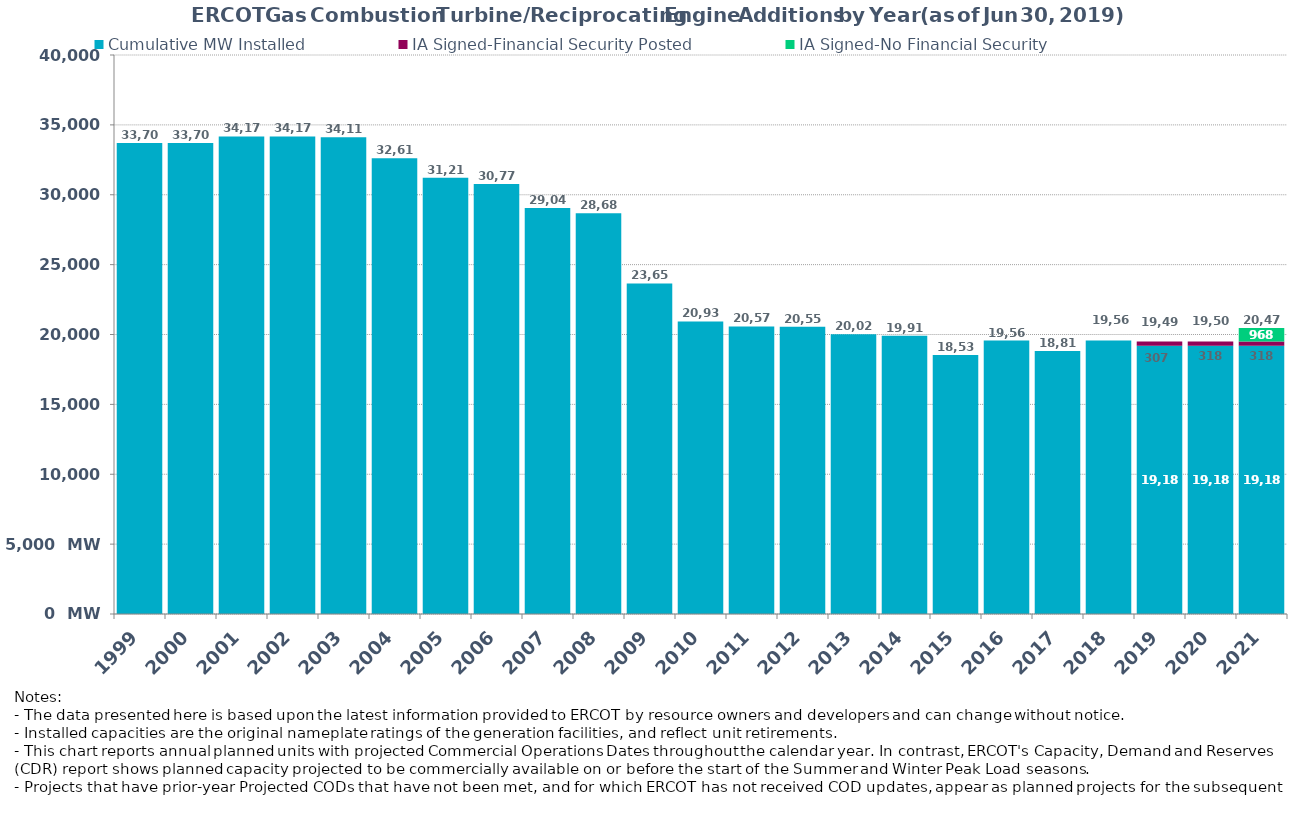
| Category | Cumulative MW Installed | IA Signed-Financial Security Posted  | IA Signed-No Financial Security  | Cumulative Installed and Planned |
|---|---|---|---|---|
| 1999.0 | 33703 | 0 | 0 | 33703 |
| 2000.0 | 33703 | 0 | 0 | 33703 |
| 2001.0 | 34170 | 0 | 0 | 34170 |
| 2002.0 | 34170 | 0 | 0 | 34170 |
| 2003.0 | 34118 | 0 | 0 | 34118 |
| 2004.0 | 32616 | 0 | 0 | 32616 |
| 2005.0 | 31217 | 0 | 0 | 31217 |
| 2006.0 | 30774 | 0 | 0 | 30774 |
| 2007.0 | 29048 | 0 | 0 | 29048 |
| 2008.0 | 28681 | 0 | 0 | 28681 |
| 2009.0 | 23651 | 0 | 0 | 23651 |
| 2010.0 | 20937 | 0 | 0 | 20937 |
| 2011.0 | 20575 | 0 | 0 | 20575 |
| 2012.0 | 20551 | 0 | 0 | 20551 |
| 2013.0 | 20026 | 0 | 0 | 20026 |
| 2014.0 | 19917 | 0 | 0 | 19917 |
| 2015.0 | 18538 | 0 | 0 | 18538 |
| 2016.0 | 19564 | 0 | 0 | 19564 |
| 2017.0 | 18818 | 0 | 0 | 18818 |
| 2018.0 | 19562 | 0 | 0 | 19562 |
| 2019.0 | 19186.3 | 307 | 0 | 19493.3 |
| 2020.0 | 19186.3 | 318 | 0 | 19504.3 |
| 2021.0 | 19186.3 | 318 | 968 | 20472.3 |